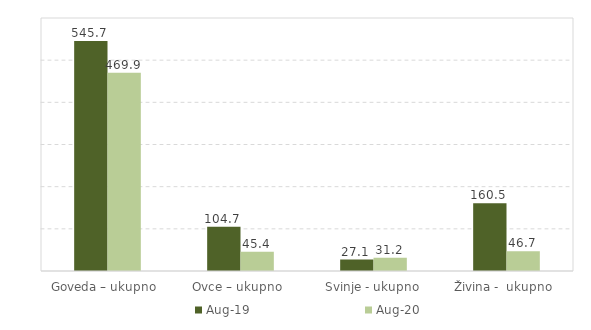
| Category | Aug-19 | Aug-20 |
|---|---|---|
| Goveda – ukupno  | 545.7 | 469.9 |
| Ovce – ukupno  | 104.7 | 45.4 |
| Svinje - ukupno | 27.1 | 31.2 |
| Živina -  ukupno  | 160.5 | 46.7 |